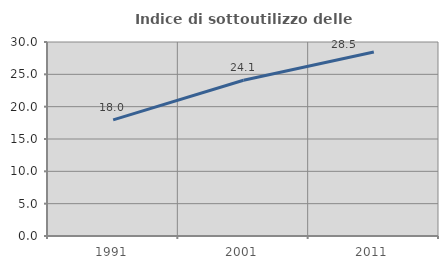
| Category | Indice di sottoutilizzo delle abitazioni  |
|---|---|
| 1991.0 | 17.963 |
| 2001.0 | 24.083 |
| 2011.0 | 28.467 |